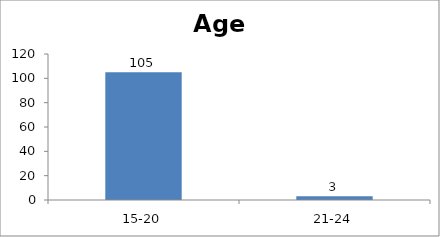
| Category | Age |
|---|---|
| 15-20 | 105 |
| 21-24 | 3 |